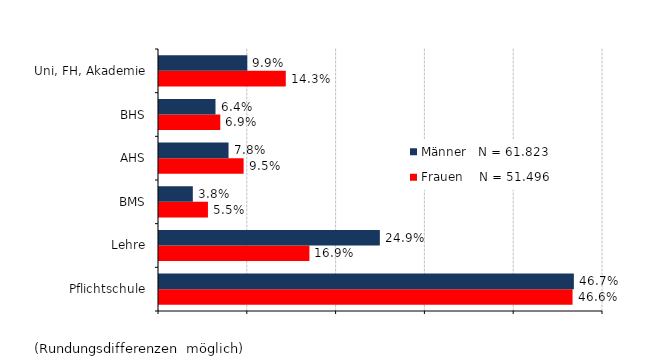
| Category | Frauen    N = 51.496 | Männer   N = 61.823 |
|---|---|---|
| Pflichtschule | 0.466 | 0.467 |
| Lehre | 0.169 | 0.249 |
| BMS | 0.055 | 0.038 |
| AHS | 0.095 | 0.078 |
| BHS | 0.069 | 0.064 |
| Uni, FH, Akademie | 0.143 | 0.099 |